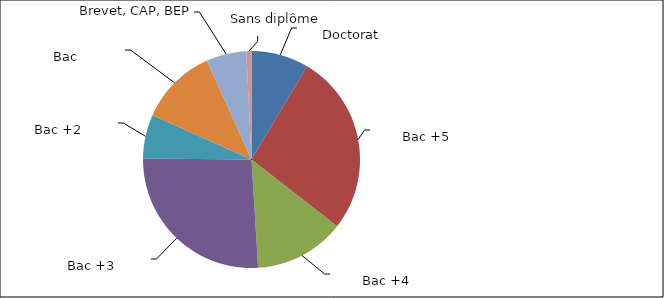
| Category | TOTAL |
|---|---|
| 0 | 0.086 |
| 1 | 0.27 |
| 2 | 0.135 |
| 3 | 0.261 |
| 4 | 0.065 |
| 5 | 0.116 |
| 6 | 0.06 |
| 7 | 0.008 |